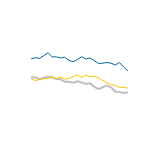
| Category | Online | Store | Phone |
|---|---|---|---|
| 0 | 7103 | 5427 | 5303 |
| 1 | 7205 | 5417 | 5117 |
| 2 | 7157 | 5268 | 5239 |
| 3 | 7384 | 5381 | 5300 |
| 4 | 7661 | 5475 | 5330 |
| 5 | 7284 | 5426 | 5464 |
| 6 | 7284 | 5276 | 5284 |
| 7 | 7186 | 5257 | 5462 |
| 8 | 7256 | 5024 | 5267 |
| 9 | 6959 | 5033 | 5327 |
| 10 | 6841 | 4927 | 5480 |
| 11 | 7046 | 5060 | 5622 |
| 12 | 7296 | 4971 | 5401 |
| 13 | 7084 | 4827 | 5617 |
| 14 | 7191 | 4885 | 5474 |
| 15 | 6936 | 4567 | 5529 |
| 16 | 6693 | 4364 | 5391 |
| 17 | 6708 | 4505 | 5146 |
| 18 | 6771 | 4687 | 4939 |
| 19 | 6708 | 4511 | 4769 |
| 20 | 6542 | 4117 | 4673 |
| 21 | 6768 | 4100 | 4520 |
| 22 | 6348 | 4002 | 4521 |
| 23 | 6009 | 4057 | 4441 |